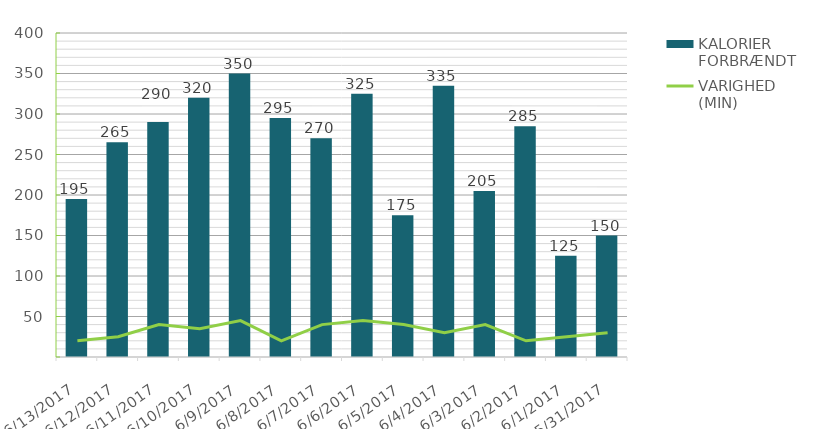
| Category | KALORIER FORBRÆNDT |
|---|---|
| 6/13/17 | 195 |
| 6/12/17 | 265 |
| 6/11/17 | 290 |
| 6/10/17 | 320 |
| 6/9/17 | 350 |
| 6/8/17 | 295 |
| 6/7/17 | 270 |
| 6/6/17 | 325 |
| 6/5/17 | 175 |
| 6/4/17 | 335 |
| 6/3/17 | 205 |
| 6/2/17 | 285 |
| 6/1/17 | 125 |
| 5/31/17 | 150 |